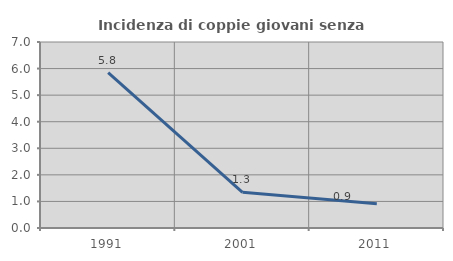
| Category | Incidenza di coppie giovani senza figli |
|---|---|
| 1991.0 | 5.848 |
| 2001.0 | 1.342 |
| 2011.0 | 0.909 |